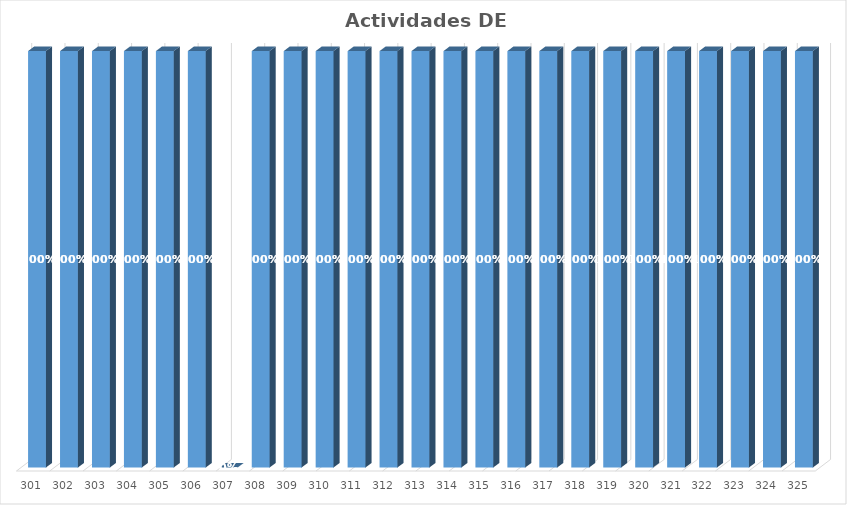
| Category | % Avance |
|---|---|
| 301.0 | 1 |
| 302.0 | 1 |
| 303.0 | 1 |
| 304.0 | 1 |
| 305.0 | 1 |
| 306.0 | 1 |
| 307.0 | 0 |
| 308.0 | 1 |
| 309.0 | 1 |
| 310.0 | 1 |
| 311.0 | 1 |
| 312.0 | 1 |
| 313.0 | 1 |
| 314.0 | 1 |
| 315.0 | 1 |
| 316.0 | 1 |
| 317.0 | 1 |
| 318.0 | 1 |
| 319.0 | 1 |
| 320.0 | 1 |
| 321.0 | 1 |
| 322.0 | 1 |
| 323.0 | 1 |
| 324.0 | 1 |
| 325.0 | 1 |